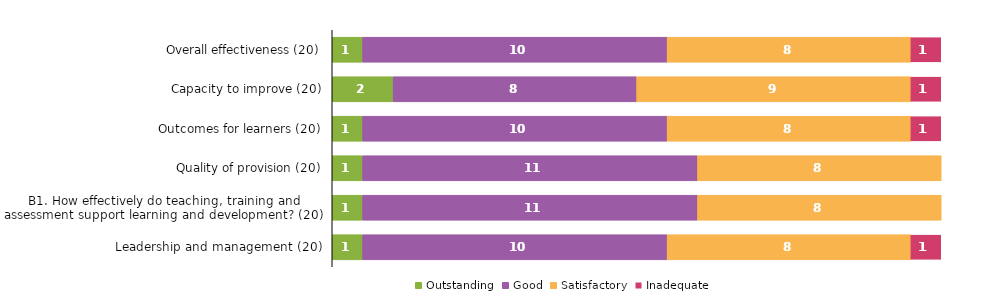
| Category | Outstanding | Good | Satisfactory | Inadequate |
|---|---|---|---|---|
| Overall effectiveness (20) | 1 | 10 | 8 | 1 |
| Capacity to improve (20) | 2 | 8 | 9 | 1 |
| Outcomes for learners (20) | 1 | 10 | 8 | 1 |
| Quality of provision (20) | 1 | 11 | 8 | 0 |
| B1. How effectively do teaching, training and assessment support learning and development? (20) | 1 | 11 | 8 | 0 |
| Leadership and management (20) | 1 | 10 | 8 | 1 |